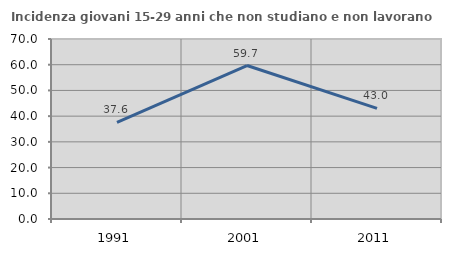
| Category | Incidenza giovani 15-29 anni che non studiano e non lavorano  |
|---|---|
| 1991.0 | 37.602 |
| 2001.0 | 59.693 |
| 2011.0 | 43.043 |